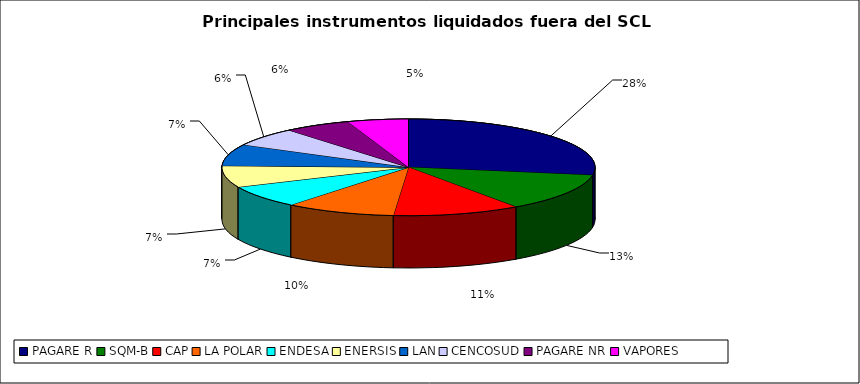
| Category | Series 0 |
|---|---|
| PAGARE R | 1990 |
| SQM-B | 910 |
| CAP | 797 |
| LA POLAR | 689 |
| ENDESA | 538 |
| ENERSIS | 521 |
| LAN | 520 |
| CENCOSUD | 446 |
| PAGARE NR | 416 |
| VAPORES | 380 |